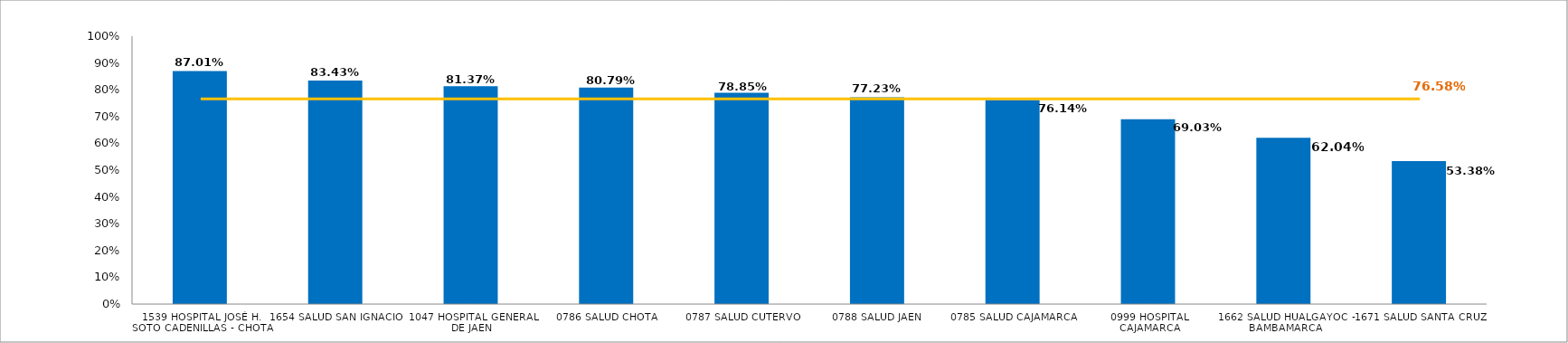
| Category | % EJECUCIÓN  |
|---|---|
| 1539 HOSPITAL JOSÉ H. SOTO CADENILLAS - CHOTA | 0.87 |
| 1654 SALUD SAN IGNACIO | 0.834 |
| 1047 HOSPITAL GENERAL DE JAEN | 0.814 |
| 0786 SALUD CHOTA | 0.808 |
| 0787 SALUD CUTERVO | 0.788 |
| 0788 SALUD JAEN | 0.772 |
| 0785 SALUD CAJAMARCA | 0.761 |
| 0999 HOSPITAL CAJAMARCA | 0.69 |
| 1662 SALUD HUALGAYOC - BAMBAMARCA | 0.62 |
| 1671 SALUD SANTA CRUZ | 0.534 |